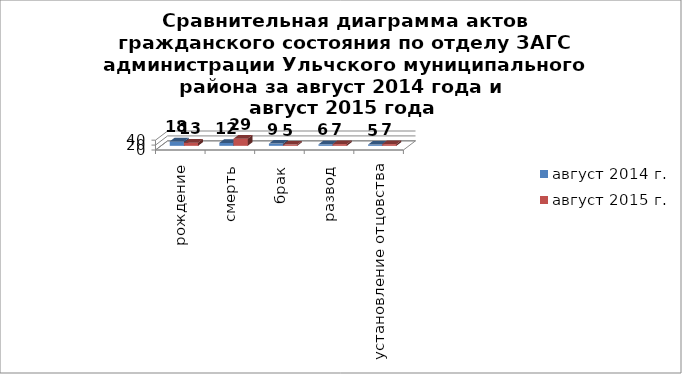
| Category | август 2014 г. | август 2015 г. |
|---|---|---|
| рождение | 18 | 13 |
| смерть | 12 | 29 |
| брак | 9 | 5 |
| развод | 6 | 7 |
| установление отцовства | 5 | 7 |